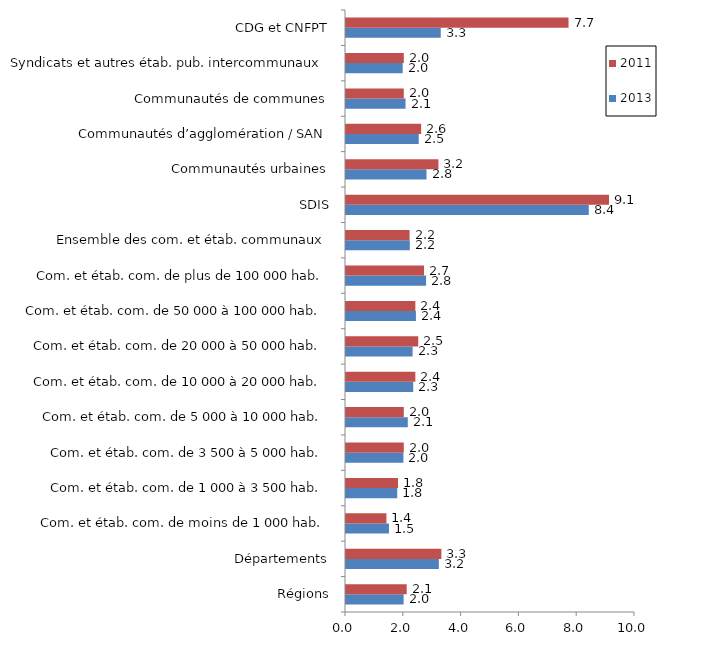
| Category | 2013 | 2011 |
|---|---|---|
| Régions | 1.993 | 2.1 |
| Départements | 3.213 | 3.3 |
| Com. et étab. com. de moins de 1 000 hab. | 1.487 | 1.4 |
| Com. et étab. com. de 1 000 à 3 500 hab. | 1.773 | 1.8 |
| Com. et étab. com. de 3 500 à 5 000 hab. | 1.986 | 2 |
| Com. et étab. com. de 5 000 à 10 000 hab. | 2.138 | 2 |
| Com. et étab. com. de 10 000 à 20 000 hab. | 2.325 | 2.4 |
| Com. et étab. com. de 20 000 à 50 000 hab. | 2.305 | 2.5 |
| Com. et étab. com. de 50 000 à 100 000 hab. | 2.42 | 2.4 |
| Com. et étab. com. de plus de 100 000 hab. | 2.77 | 2.7 |
| Ensemble des com. et étab. communaux | 2.208 | 2.2 |
| SDIS | 8.401 | 9.1 |
| Communautés urbaines | 2.786 | 3.2 |
| Communautés d’agglomération / SAN | 2.516 | 2.6 |
| Communautés de communes | 2.061 | 2 |
| Syndicats et autres étab. pub. intercommunaux | 1.961 | 2 |
| CDG et CNFPT | 3.279 | 7.7 |